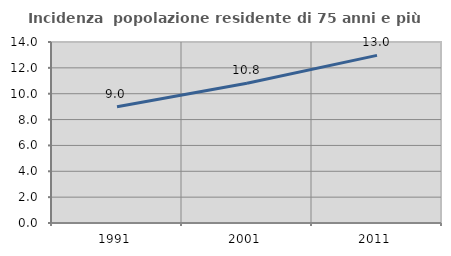
| Category | Incidenza  popolazione residente di 75 anni e più |
|---|---|
| 1991.0 | 8.995 |
| 2001.0 | 10.814 |
| 2011.0 | 12.966 |